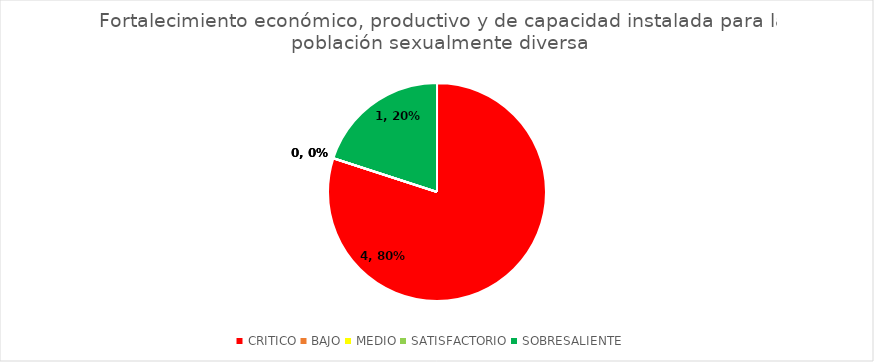
| Category | Fortalecimiento económico, productivo y de capacidad instalada para la población sexualmente diversa |
|---|---|
| CRITICO | 4 |
| BAJO | 0 |
| MEDIO | 0 |
| SATISFACTORIO | 0 |
| SOBRESALIENTE | 1 |